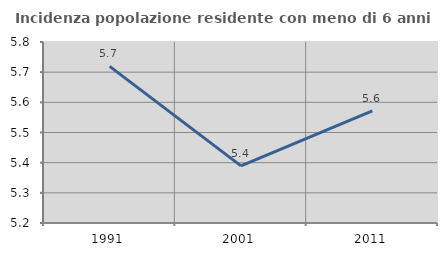
| Category | Incidenza popolazione residente con meno di 6 anni |
|---|---|
| 1991.0 | 5.719 |
| 2001.0 | 5.389 |
| 2011.0 | 5.572 |